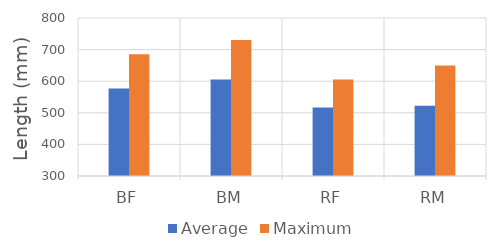
| Category | Average | Maximum |
|---|---|---|
| BF | 577 | 685 |
| BM | 605 | 730 |
| RF | 517 | 605 |
| RM | 522 | 650 |